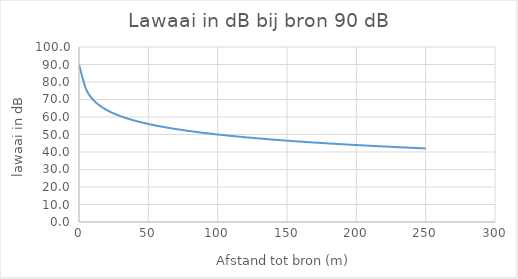
| Category | Lawaai in dB bij bron 90 dB |
|---|---|
| 0.0 | 90 |
| 5.0 | 76.021 |
| 10.0 | 70 |
| 15.0 | 66.478 |
| 20.0 | 63.979 |
| 25.0 | 62.041 |
| 30.0 | 60.458 |
| 35.0 | 59.119 |
| 40.0 | 57.959 |
| 45.0 | 56.936 |
| 50.0 | 56.021 |
| 55.0 | 55.193 |
| 60.0 | 54.437 |
| 65.0 | 53.742 |
| 70.0 | 53.098 |
| 75.0 | 52.499 |
| 80.0 | 51.938 |
| 85.0 | 51.412 |
| 90.0 | 50.915 |
| 95.0 | 50.446 |
| 100.0 | 50 |
| 105.0 | 49.576 |
| 110.0 | 49.172 |
| 115.0 | 48.786 |
| 120.0 | 48.416 |
| 125.0 | 48.062 |
| 130.0 | 47.721 |
| 135.0 | 47.393 |
| 140.0 | 47.077 |
| 145.0 | 46.773 |
| 150.0 | 46.478 |
| 155.0 | 46.193 |
| 160.0 | 45.918 |
| 165.0 | 45.65 |
| 170.0 | 45.391 |
| 175.0 | 45.139 |
| 180.0 | 44.895 |
| 185.0 | 44.657 |
| 190.0 | 44.425 |
| 195.0 | 44.199 |
| 200.0 | 43.979 |
| 205.0 | 43.765 |
| 210.0 | 43.556 |
| 215.0 | 43.351 |
| 220.0 | 43.152 |
| 225.0 | 42.956 |
| 230.0 | 42.765 |
| 235.0 | 42.579 |
| 240.0 | 42.396 |
| 245.0 | 42.217 |
| 250.0 | 42.041 |